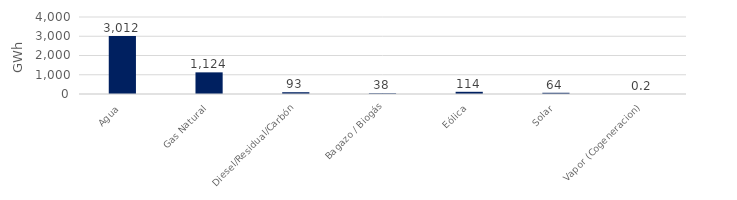
| Category | Series 0 |
|---|---|
| Agua | 3012.017 |
| Gas Natural | 1124.134 |
| Diesel/Residual/Carbón | 92.56 |
| Bagazo / Biogás | 37.68 |
| Eólica | 114.153 |
| Solar | 63.768 |
| Vapor (Cogeneracion) | 0.24 |